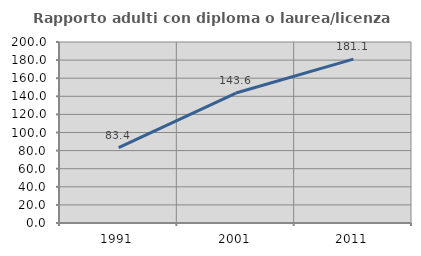
| Category | Rapporto adulti con diploma o laurea/licenza media  |
|---|---|
| 1991.0 | 83.361 |
| 2001.0 | 143.585 |
| 2011.0 | 181.116 |